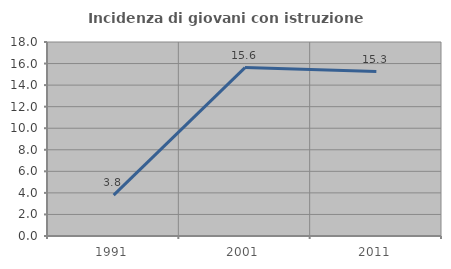
| Category | Incidenza di giovani con istruzione universitaria |
|---|---|
| 1991.0 | 3.797 |
| 2001.0 | 15.625 |
| 2011.0 | 15.254 |